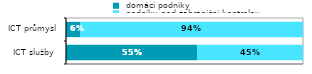
| Category |  domácí podniky |  podniky pod zahraniční kontrolou |
|---|---|---|
| ICT služby  | 0.553 | 0.447 |
| ICT průmysl | 0.059 | 0.941 |